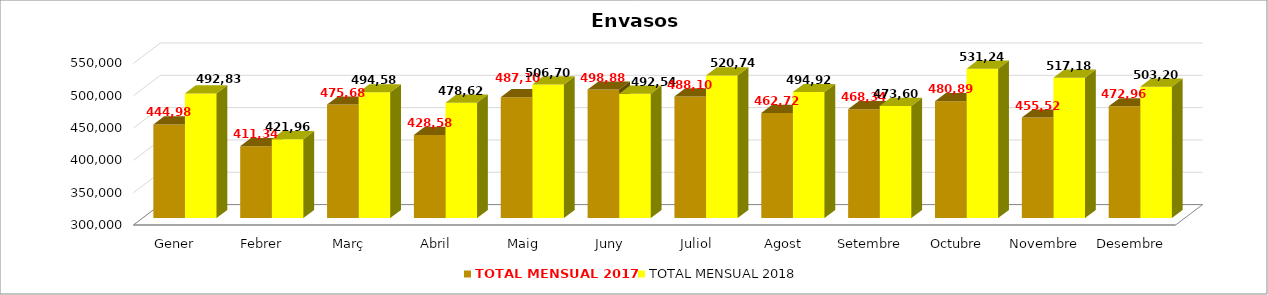
| Category | TOTAL MENSUAL 2017 | TOTAL MENSUAL 2018 |
|---|---|---|
| Gener | 444980.01 | 492829.6 |
| Febrer | 411340 | 421959.93 |
| Març | 475679.99 | 494580.01 |
| Abril | 428580 | 478619.99 |
| Maig | 487100 | 506700 |
| Juny | 498879.94 | 492539.99 |
| Juliol | 488108.26 | 520740.03 |
| Agost | 462720.13 | 494920 |
| Setembre | 468340.01 | 473600.31 |
| Octubre | 480899.38 | 531240.03 |
| Novembre | 455520.01 | 517179.988 |
| Desembre | 472960 | 503200 |